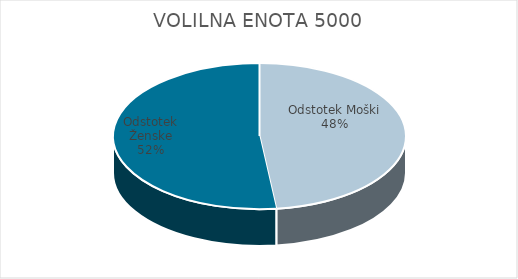
| Category | VOLILNA ENOTA 5000 | #REF! | Slovenija skupaj |
|---|---|---|---|
| Odstotek Moški | 25.88 |  | 25.28 |
| Odstotek Ženske | 27.84 |  | 27.73 |